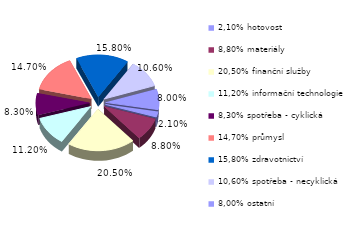
| Category | Series 0 |
|---|---|
| 2,10% hotovost | 0.021 |
| 8,80% materiály | 0.088 |
| 20,50% finanční služby | 0.205 |
| 11,20% informační technologie | 0.112 |
| 8,30% spotřeba - cyklická | 0.083 |
| 14,70% průmysl | 0.147 |
| 15,80% zdravotnictví | 0.158 |
| 10,60% spotřeba - necyklická | 0.106 |
| 8,00% ostatní | 0.08 |